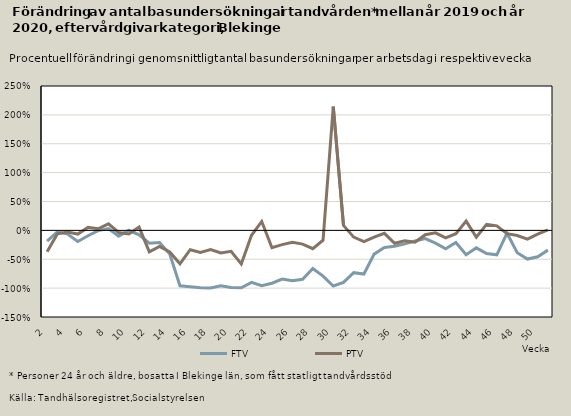
| Category | FTV | PTV |
|---|---|---|
| 2.0 | -0.187 | -0.368 |
| 3.0 | -0.025 | -0.061 |
| 4.0 | -0.063 | -0.029 |
| 5.0 | -0.192 | -0.064 |
| 6.0 | -0.093 | 0.052 |
| 7.0 | -0.004 | 0.028 |
| 8.0 | 0.03 | 0.114 |
| 9.0 | -0.099 | -0.036 |
| 10.0 | 0.002 | -0.061 |
| 11.0 | -0.077 | 0.057 |
| 12.0 | -0.223 | -0.373 |
| 13.0 | -0.212 | -0.278 |
| 14.0 | -0.408 | -0.373 |
| 15.0 | -0.959 | -0.578 |
| 16.0 | -0.976 | -0.335 |
| 17.0 | -0.994 | -0.38 |
| 18.0 | -0.996 | -0.331 |
| 19.0 | -0.96 | -0.392 |
| 20.0 | -0.991 | -0.363 |
| 21.0 | -0.995 | -0.58 |
| 22.0 | -0.9 | -0.085 |
| 23.0 | -0.959 | 0.154 |
| 24.0 | -0.915 | -0.3 |
| 25.0 | -0.842 | -0.247 |
| 26.0 | -0.871 | -0.206 |
| 27.0 | -0.848 | -0.238 |
| 28.0 | -0.66 | -0.316 |
| 29.0 | -0.792 | -0.17 |
| 30.0 | -0.963 | 2.143 |
| 31.0 | -0.902 | 0.086 |
| 32.0 | -0.733 | -0.117 |
| 33.0 | -0.755 | -0.196 |
| 34.0 | -0.411 | -0.116 |
| 35.0 | -0.296 | -0.051 |
| 36.0 | -0.274 | -0.223 |
| 37.0 | -0.233 | -0.179 |
| 38.0 | -0.183 | -0.205 |
| 39.0 | -0.143 | -0.076 |
| 40.0 | -0.22 | -0.042 |
| 41.0 | -0.317 | -0.131 |
| 42.0 | -0.209 | -0.057 |
| 43.0 | -0.423 | 0.161 |
| 44.0 | -0.303 | -0.119 |
| 45.0 | -0.402 | 0.103 |
| 46.0 | -0.423 | 0.078 |
| 47.0 | -0.049 | -0.057 |
| 48.0 | -0.388 | -0.089 |
| 49.0 | -0.497 | -0.152 |
| 50.0 | -0.458 | -0.066 |
| 51.0 | -0.342 | 0.007 |